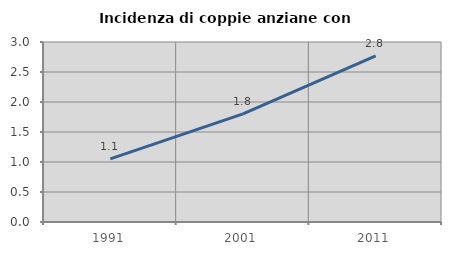
| Category | Incidenza di coppie anziane con figli |
|---|---|
| 1991.0 | 1.053 |
| 2001.0 | 1.802 |
| 2011.0 | 2.767 |